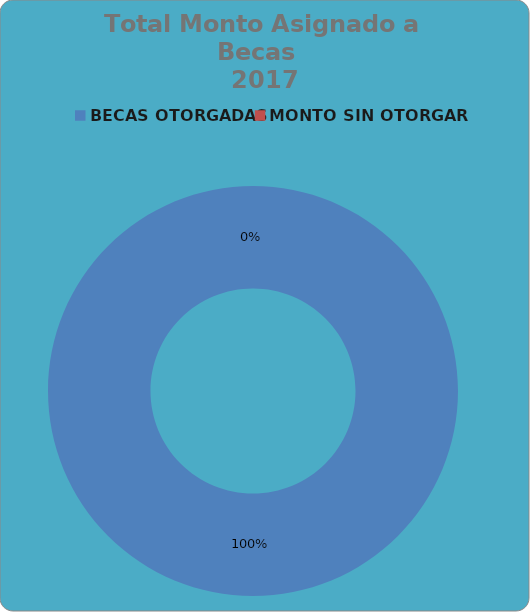
| Category | Series 0 |
|---|---|
| BECAS OTORGADAS | 1270980 |
| MONTO SIN OTORGAR | 0 |